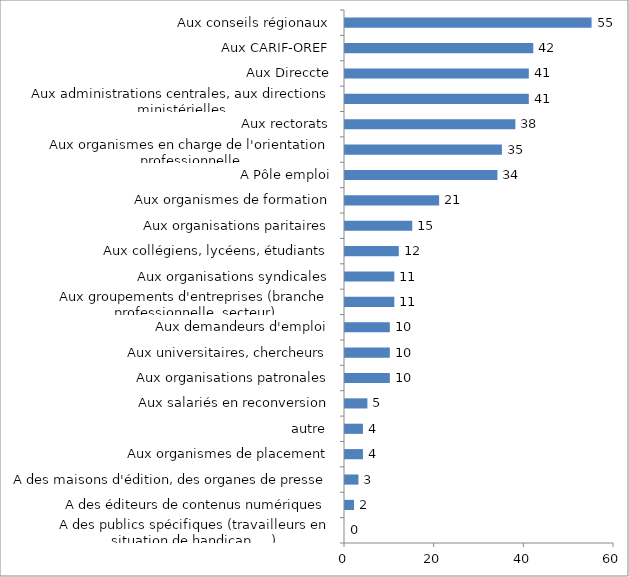
| Category | Nombre de réponses |
|---|---|
| A des publics spécifiques (travailleurs en situation de handicap, ...) | 0 |
| A des éditeurs de contenus numériques | 2 |
| A des maisons d'édition, des organes de presse | 3 |
| Aux organismes de placement | 4 |
| autre  | 4 |
| Aux salariés en reconversion | 5 |
| Aux organisations patronales | 10 |
| Aux universitaires, chercheurs | 10 |
| Aux demandeurs d'emploi | 10 |
| Aux groupements d'entreprises (branche professionnelle, secteur) | 11 |
| Aux organisations syndicales | 11 |
| Aux collégiens, lycéens, étudiants | 12 |
| Aux organisations paritaires | 15 |
| Aux organismes de formation | 21 |
| A Pôle emploi | 34 |
| Aux organismes en charge de l'orientation professionnelle | 35 |
| Aux rectorats | 38 |
| Aux administrations centrales, aux directions ministérielles | 41 |
| Aux Direccte | 41 |
| Aux CARIF-OREF | 42 |
| Aux conseils régionaux | 55 |